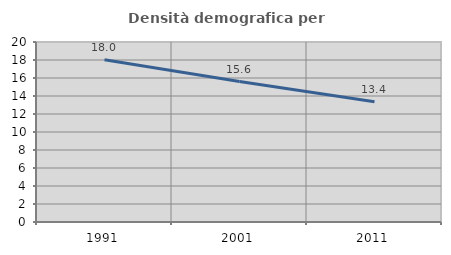
| Category | Densità demografica |
|---|---|
| 1991.0 | 18.039 |
| 2001.0 | 15.601 |
| 2011.0 | 13.358 |